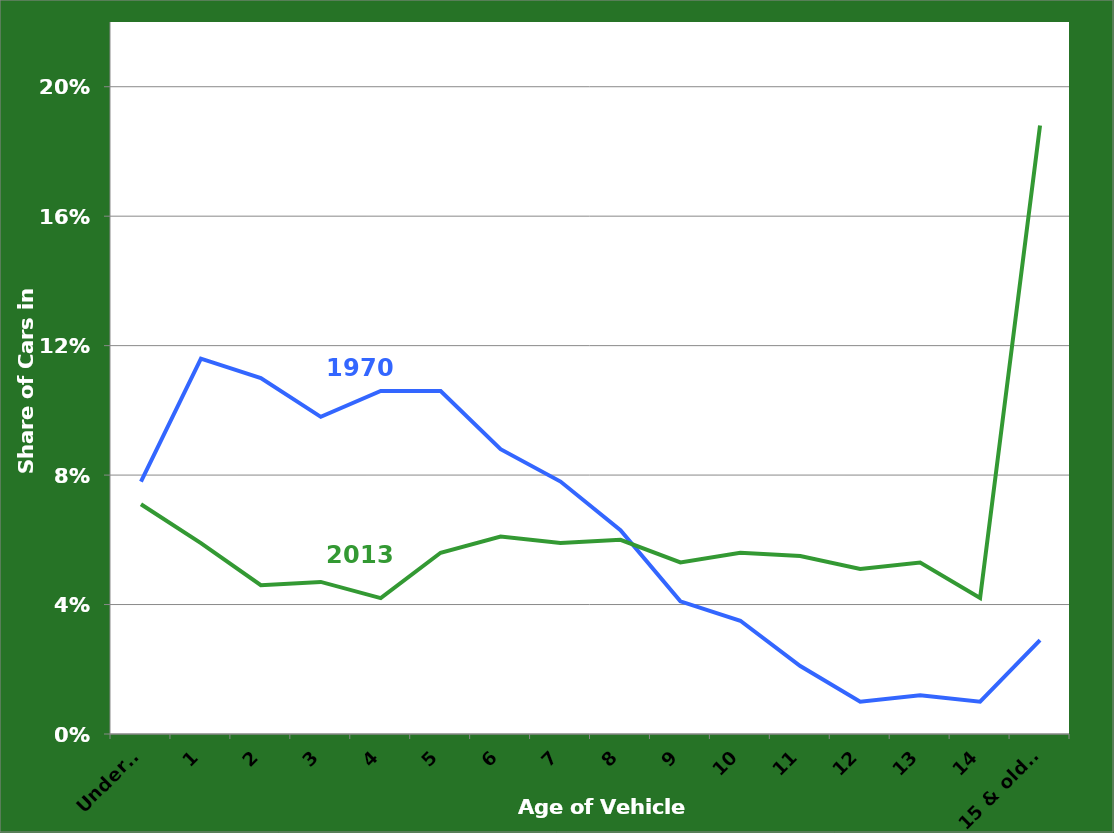
| Category | Series 0 | Series 2 |
|---|---|---|
| Under 1 | 0.078 | 0.071 |
| 1 | 0.116 | 0.059 |
| 2 | 0.11 | 0.046 |
| 3 | 0.098 | 0.047 |
| 4 | 0.106 | 0.042 |
| 5 | 0.106 | 0.056 |
| 6 | 0.088 | 0.061 |
| 7 | 0.078 | 0.059 |
| 8 | 0.063 | 0.06 |
| 9 | 0.041 | 0.053 |
| 10 | 0.035 | 0.056 |
| 11 | 0.021 | 0.055 |
| 12 | 0.01 | 0.051 |
| 13 | 0.012 | 0.053 |
| 14 | 0.01 | 0.042 |
| 15 & older | 0.029 | 0.188 |